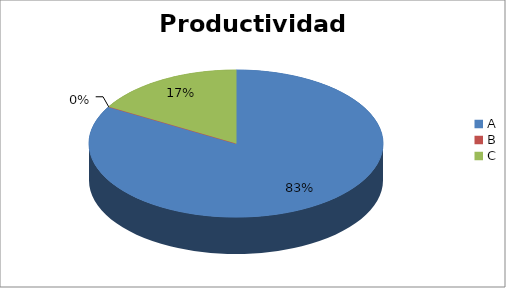
| Category | Series 0 |
|---|---|
| A | 83.333 |
| B | 0 |
| C | 16.667 |